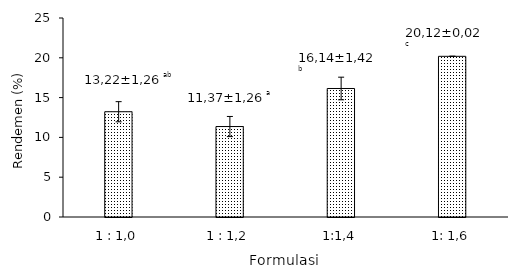
| Category | Rendemen (%) |
|---|---|
| 1 : 1,0 | 13.225 |
| 1 : 1,2 | 11.365 |
| 1:1,4 | 16.145 |
| 1: 1,6 | 20.185 |